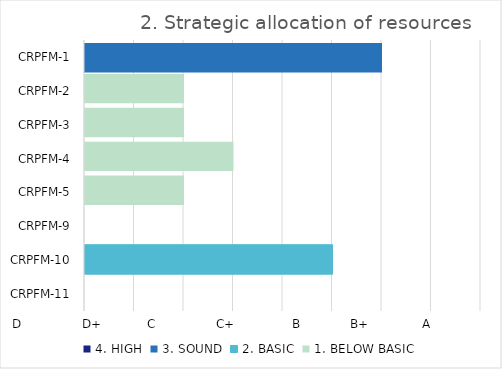
| Category | 4. HIGH | 3. SOUND | 2. BASIC | 1. BELOW BASIC |
|---|---|---|---|---|
| CRPFM-11 | 0 | 0 | 0 | 0 |
| CRPFM-10 | 0 | 0 | 2.5 | 0 |
| CRPFM-9 | 0 | 0 | 0 | 0 |
| CRPFM-5 | 0 | 0 | 0 | 1 |
| CRPFM-4 | 0 | 0 | 0 | 1.5 |
| CRPFM-3 | 0 | 0 | 0 | 1 |
| CRPFM-2 | 0 | 0 | 0 | 1 |
| CRPFM-1 | 0 | 3 | 0 | 0 |